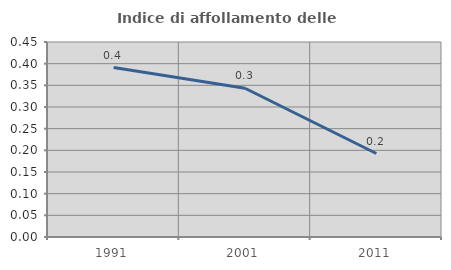
| Category | Indice di affollamento delle abitazioni  |
|---|---|
| 1991.0 | 0.391 |
| 2001.0 | 0.343 |
| 2011.0 | 0.193 |